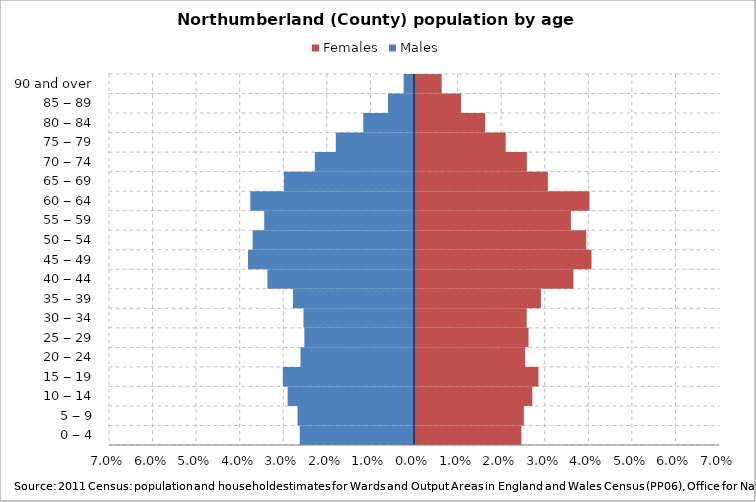
| Category | Females | Males |
|---|---|---|
| 0 ‒ 4 | 0.024 | -0.026 |
| 5 ‒ 9 | 0.025 | -0.027 |
| 10 ‒ 14 | 0.027 | -0.029 |
| 15 ‒ 19 | 0.028 | -0.03 |
| 20 ‒ 24 | 0.025 | -0.026 |
| 25 ‒ 29 | 0.026 | -0.025 |
| 30 ‒ 34 | 0.026 | -0.025 |
| 35 ‒ 39 | 0.029 | -0.028 |
| 40 ‒ 44 | 0.036 | -0.034 |
| 45 ‒ 49 | 0.041 | -0.038 |
| 50 ‒ 54 | 0.039 | -0.037 |
| 55 ‒ 59 | 0.036 | -0.034 |
| 60 ‒ 64 | 0.04 | -0.038 |
| 65 ‒ 69 | 0.03 | -0.03 |
| 70 ‒ 74 | 0.026 | -0.023 |
| 75 ‒ 79 | 0.021 | -0.018 |
| 80 ‒ 84 | 0.016 | -0.012 |
| 85 ‒ 89 | 0.011 | -0.006 |
| 90 and over | 0.006 | -0.002 |